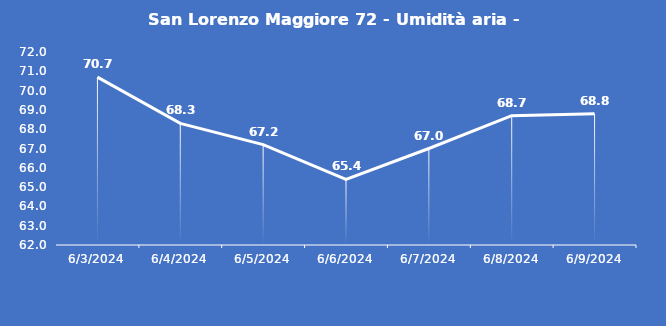
| Category | San Lorenzo Maggiore 72 - Umidità aria - Grezzo (%) |
|---|---|
| 6/3/24 | 70.7 |
| 6/4/24 | 68.3 |
| 6/5/24 | 67.2 |
| 6/6/24 | 65.4 |
| 6/7/24 | 67 |
| 6/8/24 | 68.7 |
| 6/9/24 | 68.8 |